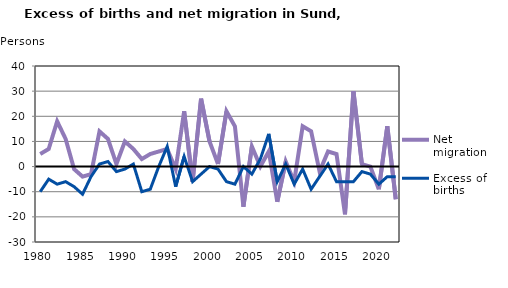
| Category | Net migration | Excess of births |
|---|---|---|
| 1980.0 | 5 | -10 |
| 1981.0 | 7 | -5 |
| 1982.0 | 18 | -7 |
| 1983.0 | 11 | -6 |
| 1984.0 | -1 | -8 |
| 1985.0 | -4 | -11 |
| 1986.0 | -3 | -4 |
| 1987.0 | 14 | 1 |
| 1988.0 | 11 | 2 |
| 1989.0 | 1 | -2 |
| 1990.0 | 10 | -1 |
| 1991.0 | 7 | 1 |
| 1992.0 | 3 | -10 |
| 1993.0 | 5 | -9 |
| 1994.0 | 6 | 0 |
| 1995.0 | 7 | 8 |
| 1996.0 | -1 | -8 |
| 1997.0 | 22 | 4 |
| 1998.0 | -6 | -6 |
| 1999.0 | 27 | -3 |
| 2000.0 | 10 | 0 |
| 2001.0 | 1 | -1 |
| 2002.0 | 22 | -6 |
| 2003.0 | 16 | -7 |
| 2004.0 | -16 | 0 |
| 2005.0 | 8 | -3 |
| 2006.0 | 0 | 3 |
| 2007.0 | 6 | 13 |
| 2008.0 | -14 | -6 |
| 2009.0 | 2 | 1 |
| 2010.0 | -6 | -7 |
| 2011.0 | 16 | -1 |
| 2012.0 | 14 | -9 |
| 2013.0 | -2 | -4 |
| 2014.0 | 6 | 1 |
| 2015.0 | 5 | -6 |
| 2016.0 | -19 | -6 |
| 2017.0 | 30 | -6 |
| 2018.0 | 1 | -2 |
| 2019.0 | 0 | -3 |
| 2020.0 | -9 | -7 |
| 2021.0 | 16 | -4 |
| 2022.0 | -13 | -4 |